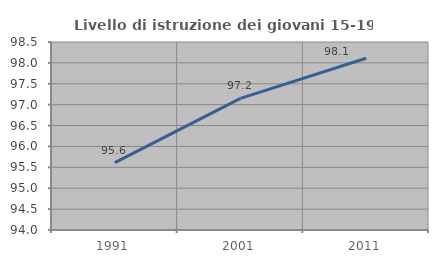
| Category | Livello di istruzione dei giovani 15-19 anni |
|---|---|
| 1991.0 | 95.614 |
| 2001.0 | 97.151 |
| 2011.0 | 98.11 |